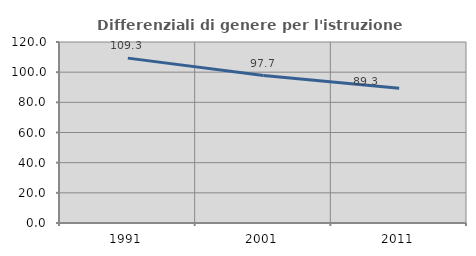
| Category | Differenziali di genere per l'istruzione superiore |
|---|---|
| 1991.0 | 109.303 |
| 2001.0 | 97.746 |
| 2011.0 | 89.264 |